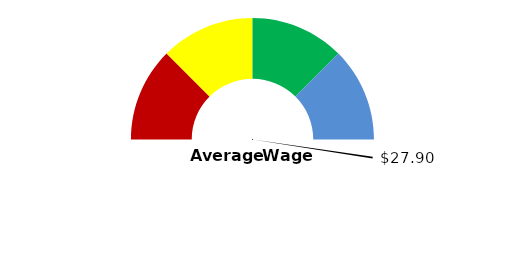
| Category | Series 1 |
|---|---|
| 0 | 220 |
| 1 | 1 |
| 2 | 200 |